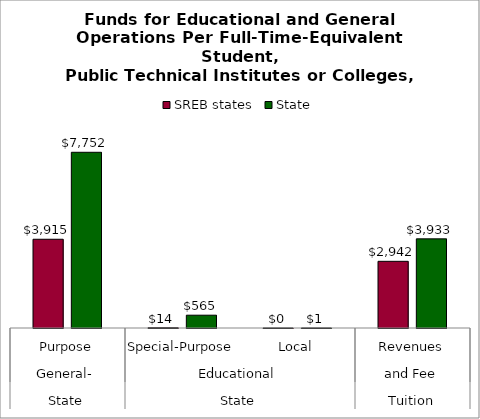
| Category | SREB states | State |
|---|---|---|
| 0 | 3915.354 | 7751.733 |
| 1 | 14.339 | 565.145 |
| 2 | 0.024 | 0.931 |
| 3 | 2941.997 | 3933.332 |